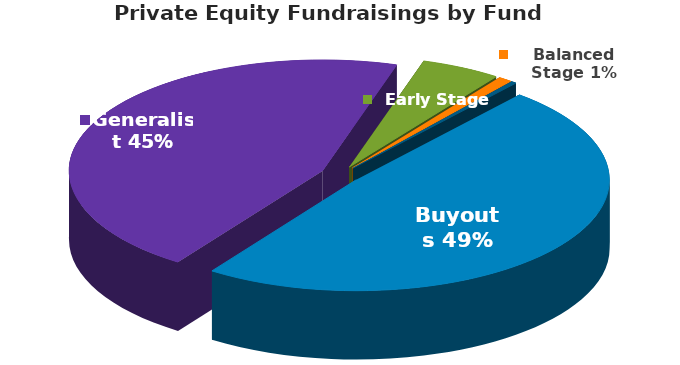
| Category | Series 0 |
|---|---|
| Buyouts | 296.605 |
| Generalist | 275.573 |
| Early Stage | 31.18 |
| Balanced Stage | 5.478 |
| Seed Stage | 2.268 |